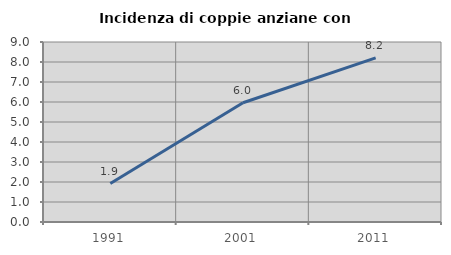
| Category | Incidenza di coppie anziane con figli |
|---|---|
| 1991.0 | 1.923 |
| 2001.0 | 5.96 |
| 2011.0 | 8.209 |